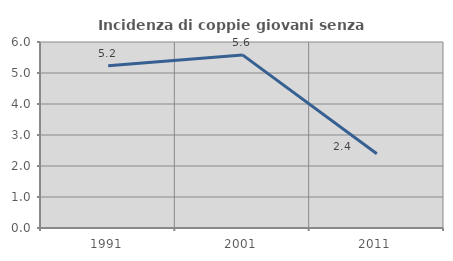
| Category | Incidenza di coppie giovani senza figli |
|---|---|
| 1991.0 | 5.237 |
| 2001.0 | 5.584 |
| 2011.0 | 2.394 |